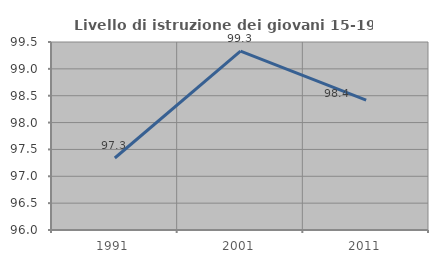
| Category | Livello di istruzione dei giovani 15-19 anni |
|---|---|
| 1991.0 | 97.34 |
| 2001.0 | 99.331 |
| 2011.0 | 98.418 |